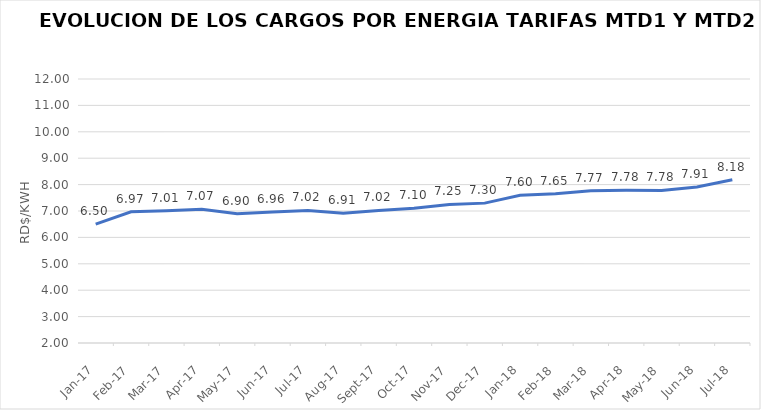
| Category | Series 0 |
|---|---|
| 2017-01-01 | 6.502 |
| 2017-02-01 | 6.97 |
| 2017-03-01 | 7.012 |
| 2017-04-01 | 7.07 |
| 2017-05-01 | 6.9 |
| 2017-06-01 | 6.959 |
| 2017-07-01 | 7.02 |
| 2017-08-01 | 6.914 |
| 2017-09-01 | 7.021 |
| 2017-10-01 | 7.101 |
| 2017-11-01 | 7.249 |
| 2017-12-01 | 7.298 |
| 2018-01-01 | 7.597 |
| 2018-02-01 | 7.65 |
| 2018-03-01 | 7.766 |
| 2018-04-01 | 7.782 |
| 2018-05-01 | 7.78 |
| 2018-06-01 | 7.912 |
| 2018-07-01 | 8.181 |